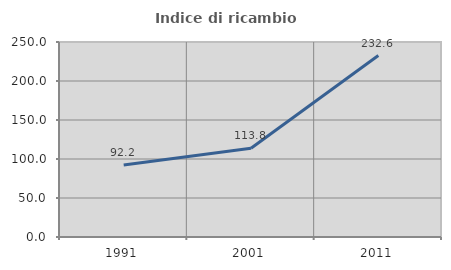
| Category | Indice di ricambio occupazionale  |
|---|---|
| 1991.0 | 92.216 |
| 2001.0 | 113.793 |
| 2011.0 | 232.624 |